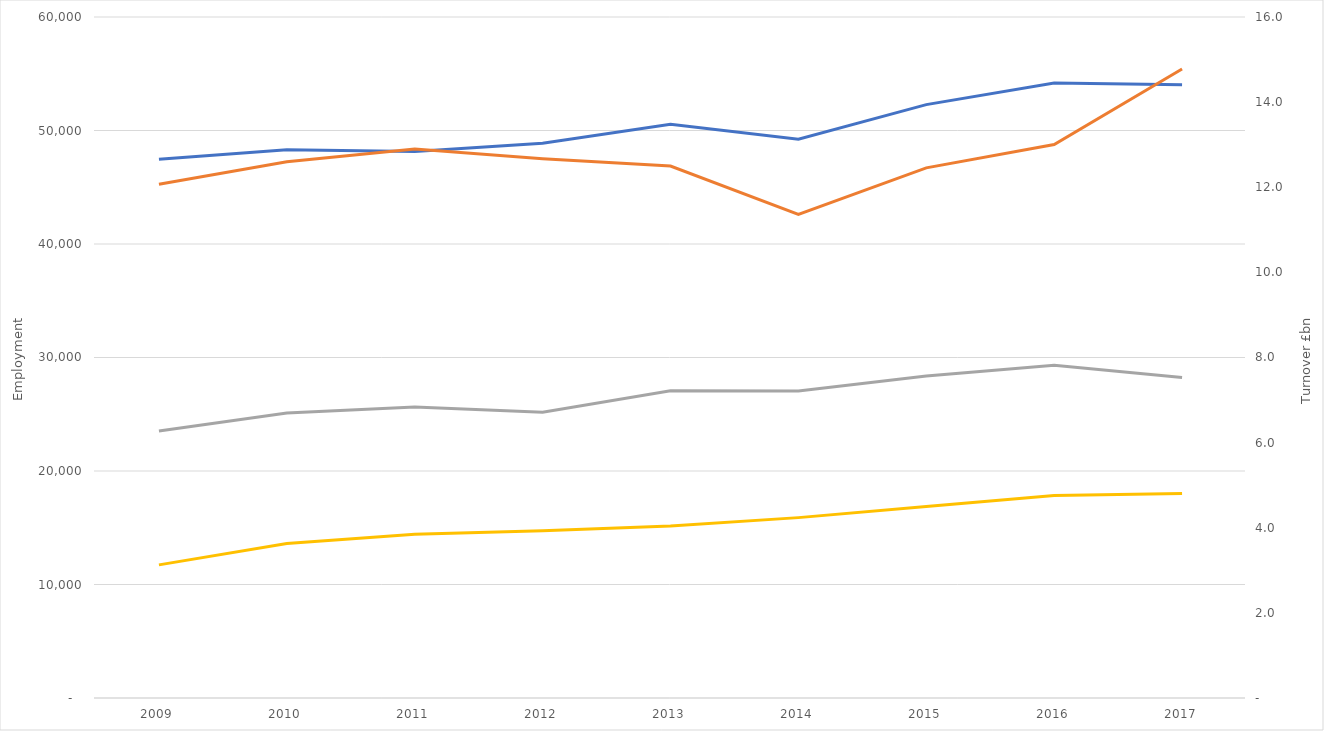
| Category | Biopharma Service & Supply employment | Medtech Service & Supply employment |
|---|---|---|
| 2009 | 47467 | 23517 |
| 2010 | 48313 | 25117 |
| 2011 | 48150 | 25634 |
| 2012 | 48873 | 25180 |
| 2013 | 50556 | 27074 |
| 2014 | 49229 | 27055 |
| 2015 | 52280 | 28371 |
| 2016 | 54190 | 29308 |
| 2017 | 54029 | 28246 |